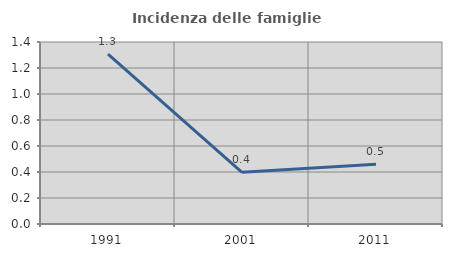
| Category | Incidenza delle famiglie numerose |
|---|---|
| 1991.0 | 1.307 |
| 2001.0 | 0.398 |
| 2011.0 | 0.46 |